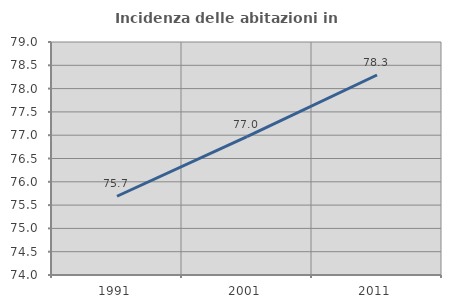
| Category | Incidenza delle abitazioni in proprietà  |
|---|---|
| 1991.0 | 75.69 |
| 2001.0 | 76.971 |
| 2011.0 | 78.292 |